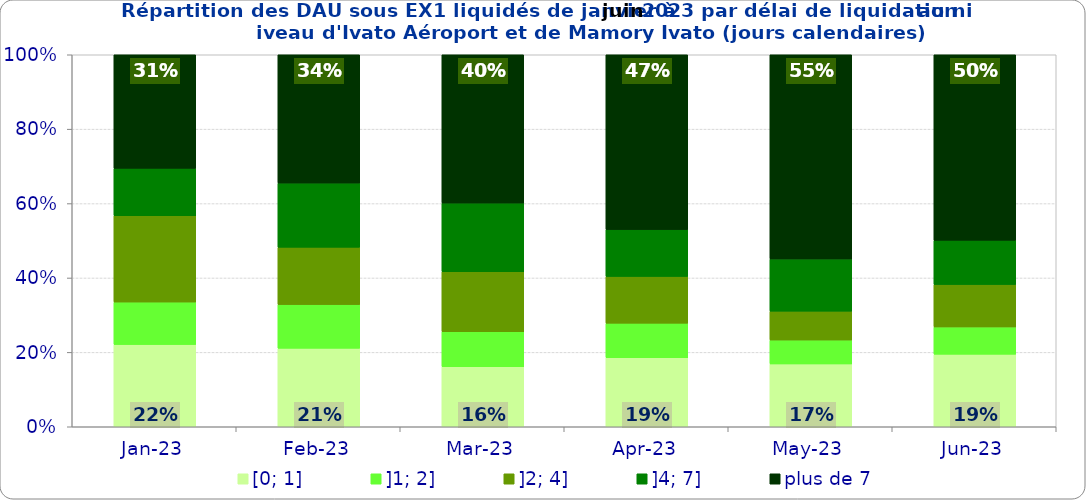
| Category | [0; 1] | ]1; 2] | ]2; 4] | ]4; 7] | plus de 7 |
|---|---|---|---|---|---|
| 2023-01-01 | 0.221 | 0.114 | 0.232 | 0.127 | 0.305 |
| 2023-02-01 | 0.211 | 0.117 | 0.154 | 0.172 | 0.345 |
| 2023-03-01 | 0.161 | 0.094 | 0.161 | 0.185 | 0.399 |
| 2023-04-01 | 0.186 | 0.093 | 0.126 | 0.126 | 0.47 |
| 2023-05-01 | 0.169 | 0.064 | 0.078 | 0.14 | 0.549 |
| 2023-06-01 | 0.195 | 0.073 | 0.114 | 0.119 | 0.499 |